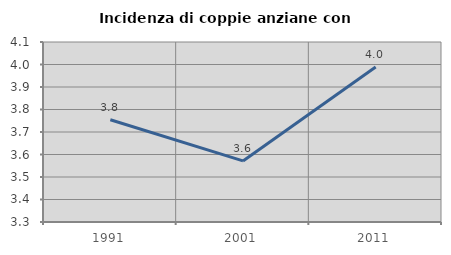
| Category | Incidenza di coppie anziane con figli |
|---|---|
| 1991.0 | 3.754 |
| 2001.0 | 3.571 |
| 2011.0 | 3.989 |